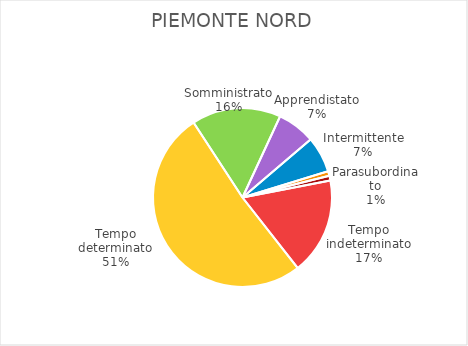
| Category | Piemonte Nord |
|---|---|
| Tempo indeterminato | 1044 |
| Tempo determinato | 3067 |
| Somministrato | 962 |
| Apprendistato | 409 |
| Intermittente | 388 |
| Domestico e a domicilio | 50 |
| Parasubordinato | 51 |